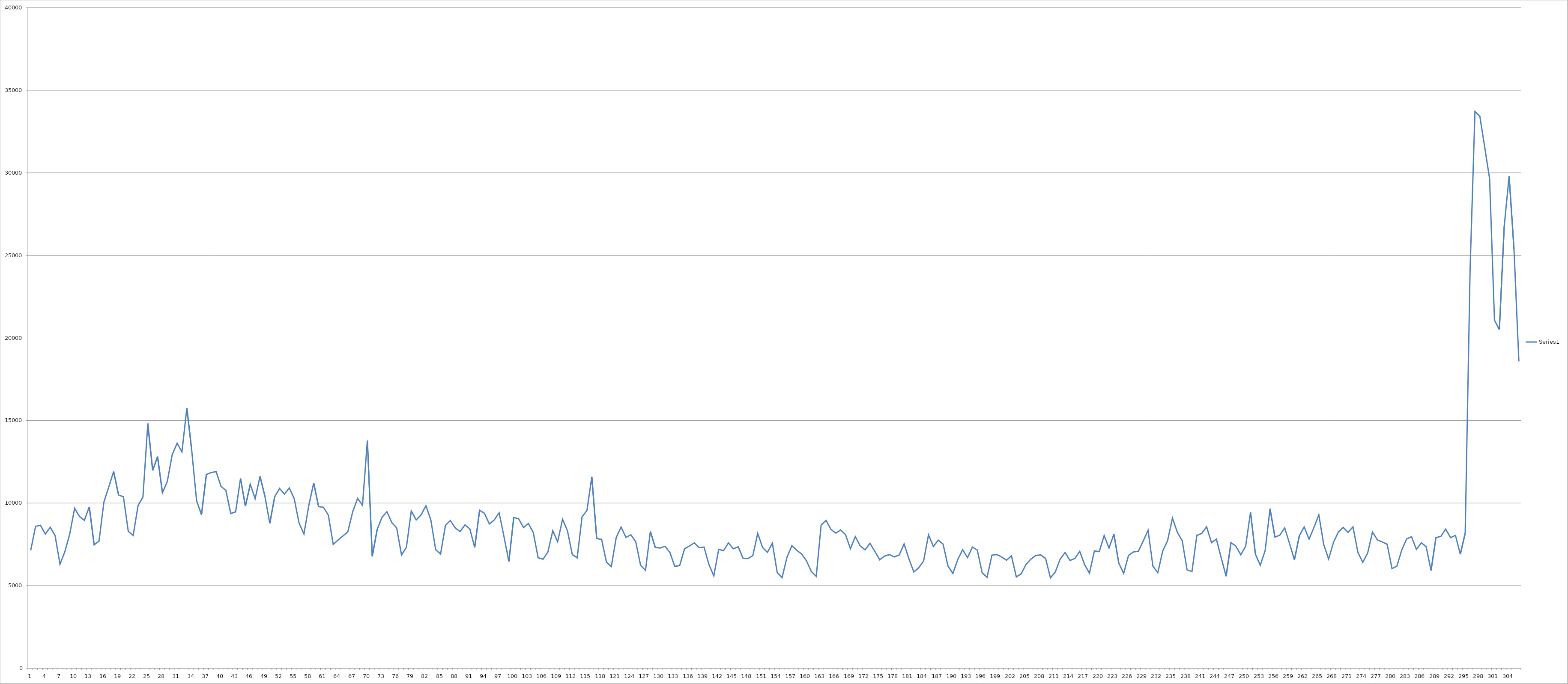
| Category | Series 0 |
|---|---|
| 0 | 7134 |
| 1 | 8590 |
| 2 | 8652 |
| 3 | 8124 |
| 4 | 8531 |
| 5 | 8027 |
| 6 | 6293 |
| 7 | 7055 |
| 8 | 8130 |
| 9 | 9685 |
| 10 | 9183 |
| 11 | 8950 |
| 12 | 9770 |
| 13 | 7469 |
| 14 | 7694 |
| 15 | 10058 |
| 16 | 10975 |
| 17 | 11910 |
| 18 | 10489 |
| 19 | 10382 |
| 20 | 8285 |
| 21 | 8038 |
| 22 | 9851 |
| 23 | 10360 |
| 24 | 14815 |
| 25 | 11975 |
| 26 | 12813 |
| 27 | 10619 |
| 28 | 11314 |
| 29 | 12930 |
| 30 | 13626 |
| 31 | 13097 |
| 32 | 15760 |
| 33 | 13187 |
| 34 | 10141 |
| 35 | 9289 |
| 36 | 11729 |
| 37 | 11848 |
| 38 | 11907 |
| 39 | 11011 |
| 40 | 10760 |
| 41 | 9367 |
| 42 | 9468 |
| 43 | 11492 |
| 44 | 9806 |
| 45 | 11139 |
| 46 | 10262 |
| 47 | 11616 |
| 48 | 10412 |
| 49 | 8772 |
| 50 | 10378 |
| 51 | 10887 |
| 52 | 10544 |
| 53 | 10910 |
| 54 | 10272 |
| 55 | 8786 |
| 56 | 8125 |
| 57 | 9862 |
| 58 | 11223 |
| 59 | 9780 |
| 60 | 9746 |
| 61 | 9266 |
| 62 | 7490 |
| 63 | 7763 |
| 64 | 8006 |
| 65 | 8267 |
| 66 | 9482 |
| 67 | 10282 |
| 68 | 9865 |
| 69 | 13790 |
| 70 | 6767 |
| 71 | 8392 |
| 72 | 9136 |
| 73 | 9477 |
| 74 | 8822 |
| 75 | 8499 |
| 76 | 6855 |
| 77 | 7321 |
| 78 | 9527 |
| 79 | 8979 |
| 80 | 9277 |
| 81 | 9836 |
| 82 | 8984 |
| 83 | 7175 |
| 84 | 6908 |
| 85 | 8644 |
| 86 | 8943 |
| 87 | 8496 |
| 88 | 8272 |
| 89 | 8679 |
| 90 | 8435 |
| 91 | 7307 |
| 92 | 9566 |
| 93 | 9377 |
| 94 | 8732 |
| 95 | 8974 |
| 96 | 9412 |
| 97 | 7966 |
| 98 | 6459 |
| 99 | 9128 |
| 100 | 9048 |
| 101 | 8520 |
| 102 | 8762 |
| 103 | 8215 |
| 104 | 6689 |
| 105 | 6598 |
| 106 | 7039 |
| 107 | 8324 |
| 108 | 7655 |
| 109 | 9020 |
| 110 | 8331 |
| 111 | 6883 |
| 112 | 6681 |
| 113 | 9166 |
| 114 | 9550 |
| 115 | 11594 |
| 116 | 7850 |
| 117 | 7799 |
| 118 | 6420 |
| 119 | 6157 |
| 120 | 7913 |
| 121 | 8544 |
| 122 | 7917 |
| 123 | 8085 |
| 124 | 7657 |
| 125 | 6225 |
| 126 | 5923 |
| 127 | 8280 |
| 128 | 7316 |
| 129 | 7275 |
| 130 | 7383 |
| 131 | 7010 |
| 132 | 6162 |
| 133 | 6213 |
| 134 | 7225 |
| 135 | 7403 |
| 136 | 7587 |
| 137 | 7297 |
| 138 | 7335 |
| 139 | 6279 |
| 140 | 5587 |
| 141 | 7197 |
| 142 | 7116 |
| 143 | 7590 |
| 144 | 7228 |
| 145 | 7348 |
| 146 | 6657 |
| 147 | 6635 |
| 148 | 6818 |
| 149 | 8164 |
| 150 | 7306 |
| 151 | 7012 |
| 152 | 7575 |
| 153 | 5787 |
| 154 | 5487 |
| 155 | 6721 |
| 156 | 7417 |
| 157 | 7138 |
| 158 | 6911 |
| 159 | 6496 |
| 160 | 5851 |
| 161 | 5561 |
| 162 | 8668 |
| 163 | 8952 |
| 164 | 8409 |
| 165 | 8179 |
| 166 | 8367 |
| 167 | 8088 |
| 168 | 7231 |
| 169 | 7969 |
| 170 | 7405 |
| 171 | 7165 |
| 172 | 7563 |
| 173 | 7078 |
| 174 | 6564 |
| 175 | 6789 |
| 176 | 6877 |
| 177 | 6740 |
| 178 | 6852 |
| 179 | 7523 |
| 180 | 6618 |
| 181 | 5821 |
| 182 | 6082 |
| 183 | 6491 |
| 184 | 8075 |
| 185 | 7371 |
| 186 | 7756 |
| 187 | 7510 |
| 188 | 6179 |
| 189 | 5733 |
| 190 | 6582 |
| 191 | 7172 |
| 192 | 6696 |
| 193 | 7334 |
| 194 | 7153 |
| 195 | 5782 |
| 196 | 5502 |
| 197 | 6844 |
| 198 | 6881 |
| 199 | 6733 |
| 200 | 6538 |
| 201 | 6810 |
| 202 | 5523 |
| 203 | 5720 |
| 204 | 6284 |
| 205 | 6606 |
| 206 | 6826 |
| 207 | 6859 |
| 208 | 6645 |
| 209 | 5462 |
| 210 | 5834 |
| 211 | 6610 |
| 212 | 7003 |
| 213 | 6523 |
| 214 | 6645 |
| 215 | 7077 |
| 216 | 6267 |
| 217 | 5752 |
| 218 | 7105 |
| 219 | 7058 |
| 220 | 8033 |
| 221 | 7273 |
| 222 | 8120 |
| 223 | 6361 |
| 224 | 5739 |
| 225 | 6833 |
| 226 | 7040 |
| 227 | 7080 |
| 228 | 7691 |
| 229 | 8352 |
| 230 | 6174 |
| 231 | 5780 |
| 232 | 7089 |
| 233 | 7716 |
| 234 | 9091 |
| 235 | 8234 |
| 236 | 7719 |
| 237 | 5950 |
| 238 | 5850 |
| 239 | 8040 |
| 240 | 8160 |
| 241 | 8561 |
| 242 | 7601 |
| 243 | 7816 |
| 244 | 6673 |
| 245 | 5567 |
| 246 | 7603 |
| 247 | 7389 |
| 248 | 6868 |
| 249 | 7379 |
| 250 | 9446 |
| 251 | 6905 |
| 252 | 6231 |
| 253 | 7126 |
| 254 | 9659 |
| 255 | 7936 |
| 256 | 8052 |
| 257 | 8499 |
| 258 | 7548 |
| 259 | 6559 |
| 260 | 8014 |
| 261 | 8554 |
| 262 | 7810 |
| 263 | 8522 |
| 264 | 9286 |
| 265 | 7492 |
| 266 | 6609 |
| 267 | 7616 |
| 268 | 8240 |
| 269 | 8526 |
| 270 | 8223 |
| 271 | 8560 |
| 272 | 7022 |
| 273 | 6412 |
| 274 | 6967 |
| 275 | 8248 |
| 276 | 7767 |
| 277 | 7647 |
| 278 | 7504 |
| 279 | 6025 |
| 280 | 6181 |
| 281 | 7158 |
| 282 | 7823 |
| 283 | 7964 |
| 284 | 7189 |
| 285 | 7596 |
| 286 | 7356 |
| 287 | 5910 |
| 288 | 7908 |
| 289 | 7978 |
| 290 | 8420 |
| 291 | 7907 |
| 292 | 8043 |
| 293 | 6900 |
| 294 | 8177 |
| 295 | 24127 |
| 296 | 33712 |
| 297 | 33424 |
| 298 | 31554 |
| 299 | 29637 |
| 300 | 21079 |
| 301 | 20500 |
| 302 | 26777 |
| 303 | 29798 |
| 304 | 25376 |
| 305 | 18577 |